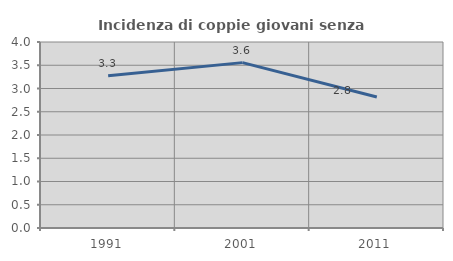
| Category | Incidenza di coppie giovani senza figli |
|---|---|
| 1991.0 | 3.272 |
| 2001.0 | 3.556 |
| 2011.0 | 2.817 |